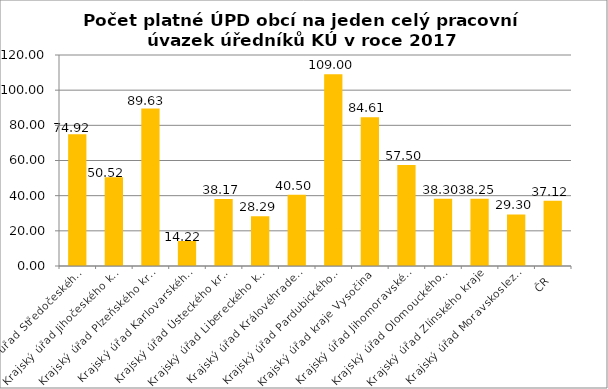
| Category | Počet platné ÚPD obcí na jeden celý pracovní úvazek úředníků KÚ |
|---|---|
| Krajský úřad Středočeského kraje | 74.92 |
| Krajský úřad Jihočeského kraje | 50.52 |
| Krajský úřad Plzeňského kraje | 89.63 |
| Krajský úřad Karlovarského kraje | 14.22 |
| Krajský úřad Ústeckého kraje | 38.17 |
| Krajský úřad Libereckého kraje | 28.29 |
| Krajský úřad Královéhradeckého kraje | 40.5 |
| Krajský úřad Pardubického kraje | 109 |
| Krajský úřad kraje Vysočina | 84.61 |
| Krajský úřad Jihomoravského kraje | 57.5 |
| Krajský úřad Olomouckého kraje | 38.3 |
| Krajský úřad Zlínského kraje | 38.25 |
| Krajský úřad Moravskoslezského kraje | 29.3 |
| ČR | 37.12 |